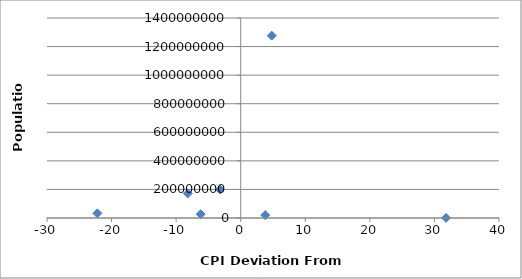
| Category | Population |
|---|---|
| 4.799999999999997 | 1276267000 |
| -3.200000000000003 | 199085847 |
| -8.200000000000003 | 171700000 |
| -22.200000000000003 | 32564342 |
| -6.200000000000003 | 26494504 |
| 31.799999999999997 | 742737 |
| 3.799999999999997 | 20277597 |